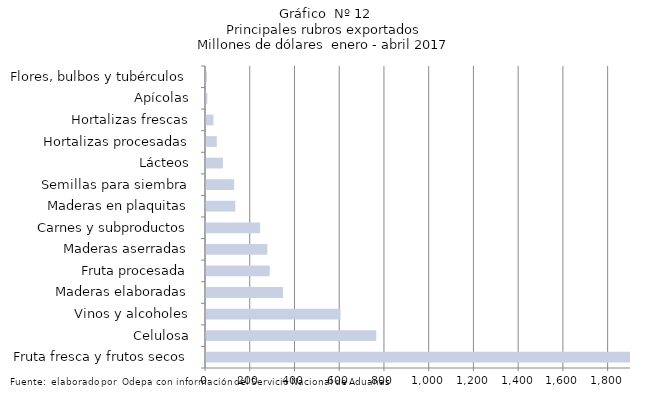
| Category | Series 7 |
|---|---|
| Fruta fresca y frutos secos | 1946872.373 |
| Celulosa | 761422.03 |
| Vinos y alcoholes | 601619.921 |
| Maderas elaboradas | 344380.716 |
| Fruta procesada | 285082.721 |
| Maderas aserradas | 274226.274 |
| Carnes y subproductos | 242020.756 |
| Maderas en plaquitas | 130896.989 |
| Semillas para siembra | 125892.633 |
| Lácteos | 75610.524 |
| Hortalizas procesadas | 48356.161 |
| Hortalizas frescas | 33483.183 |
| Apícolas | 6040.275 |
| Flores, bulbos y tubérculos | 4086.173 |